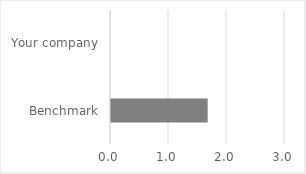
| Category | Strengthening of stakeholder collaboration |
|---|---|
| Benchmark | 1.667 |
| Your company | 0 |